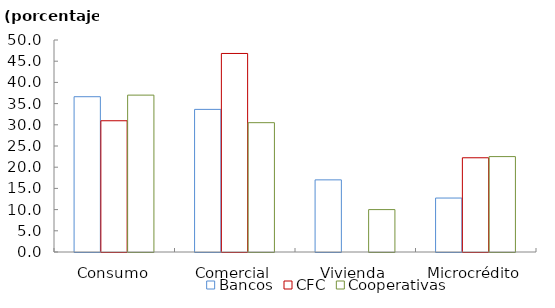
| Category | Bancos | CFC | Cooperativas |
|---|---|---|---|
| Consumo | 36.623 | 30.952 | 37 |
| Comercial | 33.636 | 46.825 | 30.5 |
| Vivienda | 17.013 | 0 | 10 |
| Microcrédito | 12.727 | 22.222 | 22.5 |